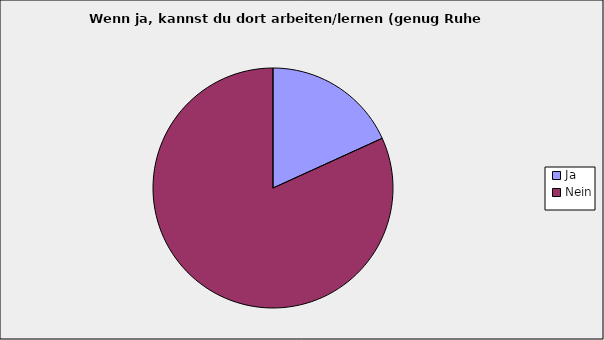
| Category | Series 0 |
|---|---|
| Ja | 0.182 |
| Nein | 0.818 |